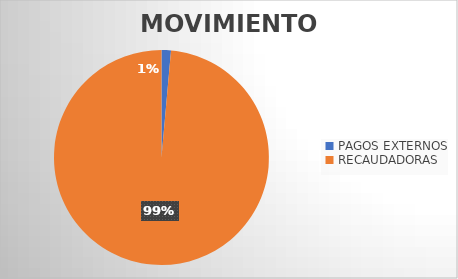
| Category | MOVIMIENTOS |
|---|---|
| PAGOS EXTERNOS | 326 |
| RECAUDADORAS | 22737 |